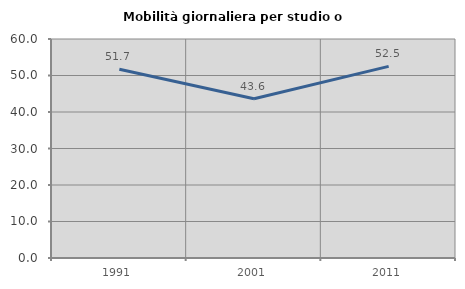
| Category | Mobilità giornaliera per studio o lavoro |
|---|---|
| 1991.0 | 51.729 |
| 2001.0 | 43.638 |
| 2011.0 | 52.495 |